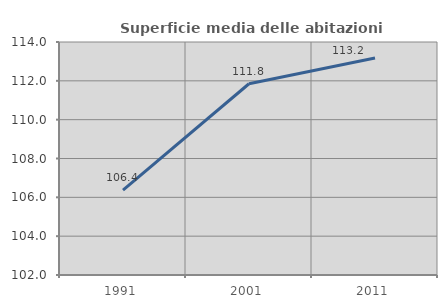
| Category | Superficie media delle abitazioni occupate |
|---|---|
| 1991.0 | 106.372 |
| 2001.0 | 111.849 |
| 2011.0 | 113.175 |